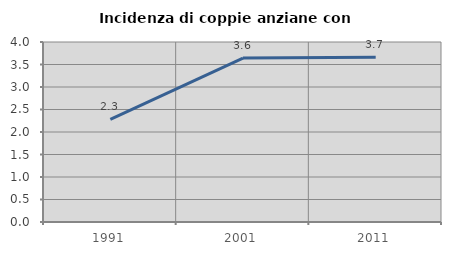
| Category | Incidenza di coppie anziane con figli |
|---|---|
| 1991.0 | 2.281 |
| 2001.0 | 3.644 |
| 2011.0 | 3.661 |